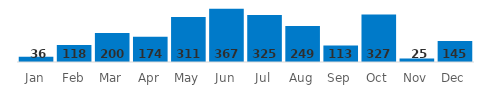
| Category | Net Profit |
|---|---|
| Jan | 36 |
| Feb | 118 |
| Mar | 200 |
| Apr | 174 |
| May | 311 |
| Jun | 367 |
| Jul | 325 |
| Aug | 249 |
| Sep | 113 |
| Oct | 327 |
| Nov | 25 |
| Dec | 145 |